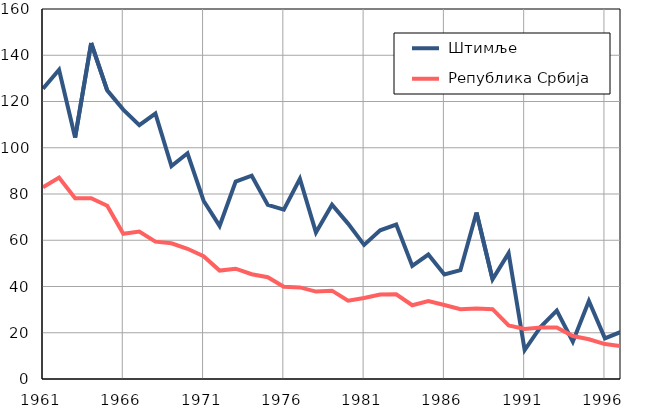
| Category |  Штимље |  Република Србија |
|---|---|---|
| 1961.0 | 125.5 | 82.9 |
| 1962.0 | 133.7 | 87.1 |
| 1963.0 | 104.4 | 78.2 |
| 1964.0 | 145.3 | 78.2 |
| 1965.0 | 124.8 | 74.9 |
| 1966.0 | 116.5 | 62.8 |
| 1967.0 | 109.8 | 63.8 |
| 1968.0 | 114.8 | 59.4 |
| 1969.0 | 92.1 | 58.7 |
| 1970.0 | 97.6 | 56.3 |
| 1971.0 | 77.1 | 53.1 |
| 1972.0 | 66.2 | 46.9 |
| 1973.0 | 85.4 | 47.7 |
| 1974.0 | 87.9 | 45.3 |
| 1975.0 | 75.3 | 44 |
| 1976.0 | 73.2 | 39.9 |
| 1977.0 | 86.6 | 39.6 |
| 1978.0 | 63.4 | 37.8 |
| 1979.0 | 75.4 | 38.2 |
| 1980.0 | 67.2 | 33.9 |
| 1981.0 | 58 | 35 |
| 1982.0 | 64.3 | 36.5 |
| 1983.0 | 66.8 | 36.6 |
| 1984.0 | 48.9 | 31.9 |
| 1985.0 | 53.8 | 33.7 |
| 1986.0 | 45.2 | 32 |
| 1987.0 | 47.1 | 30.2 |
| 1988.0 | 72 | 30.5 |
| 1989.0 | 43.1 | 30.2 |
| 1990.0 | 54.4 | 23.2 |
| 1991.0 | 12.5 | 21.6 |
| 1992.0 | 22.6 | 22.3 |
| 1993.0 | 29.6 | 22.3 |
| 1994.0 | 16.1 | 18.6 |
| 1995.0 | 33.7 | 17.2 |
| 1996.0 | 17.6 | 15.1 |
| 1997.0 | 20.4 | 14.2 |